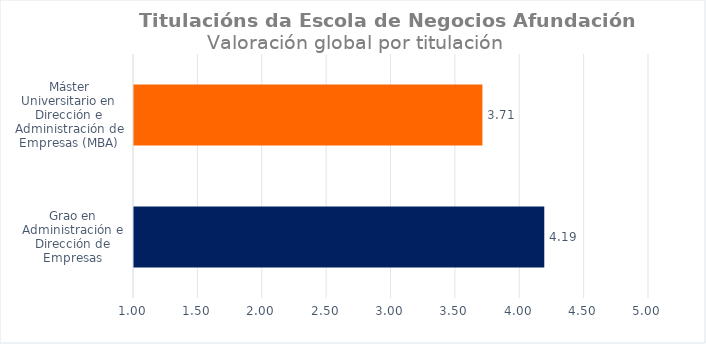
| Category | Series 0 |
|---|---|
| Grao en Administración e Dirección de Empresas | 4.187 |
| Máster Universitario en Dirección e Administración de Empresas (MBA) | 3.706 |